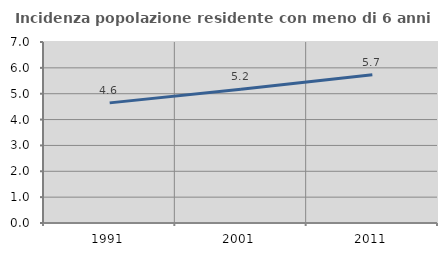
| Category | Incidenza popolazione residente con meno di 6 anni |
|---|---|
| 1991.0 | 4.646 |
| 2001.0 | 5.174 |
| 2011.0 | 5.729 |